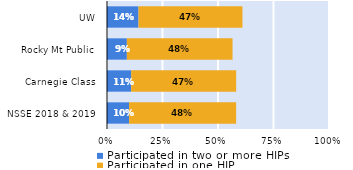
| Category | Participated in two or more HIPs | Participated in one HIP |
|---|---|---|
| NSSE 2018 & 2019 | 0.099 | 0.482 |
| Carnegie Class | 0.109 | 0.473 |
| Rocky Mt Public | 0.089 | 0.476 |
| UW | 0.142 | 0.468 |